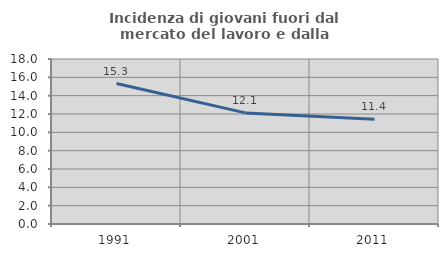
| Category | Incidenza di giovani fuori dal mercato del lavoro e dalla formazione  |
|---|---|
| 1991.0 | 15.319 |
| 2001.0 | 12.121 |
| 2011.0 | 11.429 |